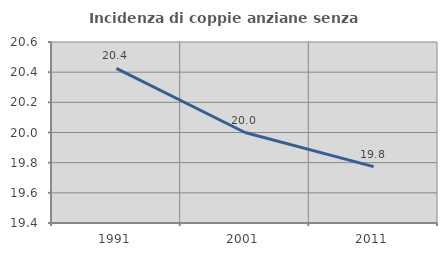
| Category | Incidenza di coppie anziane senza figli  |
|---|---|
| 1991.0 | 20.426 |
| 2001.0 | 20 |
| 2011.0 | 19.774 |